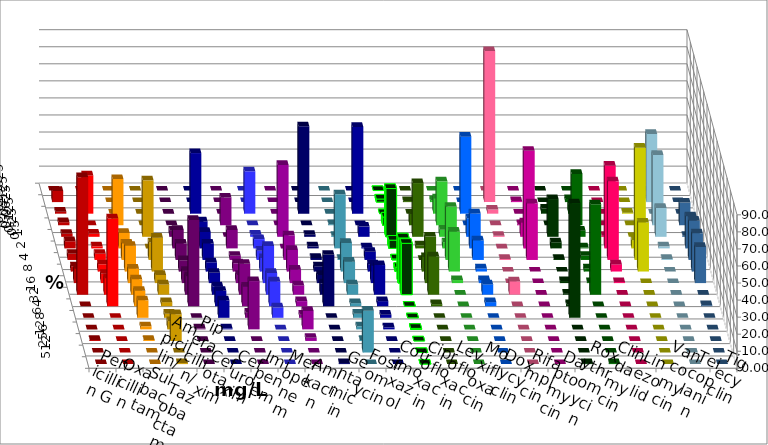
| Category | Penicillin G | Oxacillin | Ampicillin/ Sulbactam | Piperacillin/ Tazobactam | Cefotaxim | Cefuroxim | Imipenem | Meropenem | Amikacin | Gentamicin | Fosfomycin | Cotrimoxazol | Ciprofloxacin | Levofloxacin | Moxifloxacin | Doxycyclin | Rifampicin | Daptomycin | Roxythromycin | Clindamycin | Linezolid | Vancomycin | Teicoplanin | Tigecyclin |
|---|---|---|---|---|---|---|---|---|---|---|---|---|---|---|---|---|---|---|---|---|---|---|---|---|
| 0.015625 | 0 | 0 | 0 | 0 | 0 | 0 | 0 | 0 | 0 | 0 | 0 | 0 | 0 | 0 | 0 | 0 | 0 | 0 | 0 | 0 | 0 | 0 | 0 | 0 |
| 0.03125 | 6.587 | 0 | 0 | 0 | 0 | 0 | 0 | 0 | 0 | 0 | 0 | 0 | 1.807 | 0.606 | 1.198 | 0 | 88.554 | 0.602 | 0 | 1.807 | 0 | 0 | 0 | 40 |
| 0.0625 | 1.198 | 22.424 | 0 | 0 | 0 | 0 | 35.542 | 24.848 | 0 | 51.205 | 0 | 50.898 | 0 | 0 | 8.982 | 45.181 | 2.41 | 0 | 2.994 | 5.422 | 0 | 0.599 | 0 | 0 |
| 0.125 | 1.796 | 0 | 27.108 | 0 | 0 | 16.265 | 0 | 0 | 0 | 0 | 0.599 | 0 | 4.819 | 6.667 | 25.749 | 0 | 0 | 0.602 | 0 | 30.12 | 0 | 0 | 13.333 | 41.212 |
| 0.25 | 1.796 | 1.818 | 0 | 33.133 | 3.614 | 0 | 9.036 | 1.212 | 42.169 | 1.205 | 0.599 | 5.988 | 28.313 | 31.515 | 4.192 | 10.843 | 0.602 | 8.434 | 22.156 | 3.614 | 0.599 | 0 | 0.606 | 16.97 |
| 0.5 | 4.192 | 1.212 | 9.036 | 0 | 10.843 | 10.843 | 9.639 | 5.455 | 0 | 1.205 | 31.737 | 0.599 | 4.819 | 1.818 | 3.593 | 20.482 | 0 | 57.229 | 3.593 | 0.602 | 48.503 | 4.79 | 18.788 | 1.212 |
| 1.0 | 3.593 | 3.636 | 9.639 | 10.241 | 9.639 | 2.41 | 9.639 | 5.455 | 14.458 | 1.205 | 0.599 | 4.79 | 0.602 | 0 | 31.138 | 11.446 | 0.602 | 33.133 | 0.599 | 2.41 | 46.108 | 65.868 | 23.03 | 0.606 |
| 2.0 | 2.994 | 4.242 | 15.06 | 19.88 | 6.627 | 4.819 | 5.422 | 7.879 | 12.651 | 3.012 | 16.766 | 4.192 | 2.41 | 8.485 | 23.353 | 1.807 | 0 | 0 | 0 | 1.807 | 4.192 | 28.743 | 22.424 | 0 |
| 4.0 | 8.383 | 5.455 | 8.434 | 4.819 | 7.229 | 4.819 | 6.024 | 21.818 | 7.831 | 4.819 | 12.575 | 10.18 | 26.506 | 27.273 | 1.796 | 1.807 | 0 | 0 | 1.198 | 0.602 | 0.599 | 0 | 21.212 | 0 |
| 8.0 | 68.862 | 9.697 | 9.036 | 6.024 | 10.843 | 18.072 | 4.819 | 12.727 | 5.422 | 6.627 | 5.988 | 17.365 | 30.12 | 22.424 | 0 | 6.024 | 7.831 | 0 | 0.599 | 53.012 | 0 | 0 | 0 | 0 |
| 16.0 | 0 | 51.515 | 9.036 | 2.41 | 50.602 | 11.446 | 9.036 | 14.545 | 3.012 | 30.12 | 1.796 | 2.994 | 0 | 1.212 | 0 | 2.41 | 0 | 0 | 1.198 | 0 | 0 | 0 | 0.606 | 0 |
| 32.0 | 0 | 0 | 10.241 | 2.41 | 0 | 3.012 | 10.241 | 6.061 | 1.807 | 0 | 2.395 | 1.796 | 0 | 0 | 0 | 0 | 0 | 0 | 67.066 | 0 | 0 | 0 | 0 | 0 |
| 64.0 | 0 | 0 | 1.807 | 4.819 | 0.602 | 28.313 | 0.602 | 0 | 10.843 | 0 | 1.796 | 1.198 | 0.602 | 0 | 0 | 0 | 0 | 0 | 0 | 0 | 0 | 0 | 0 | 0 |
| 128.0 | 0.599 | 0 | 0.602 | 15.663 | 0 | 0 | 0 | 0 | 1.807 | 0 | 0.599 | 0 | 0 | 0 | 0 | 0 | 0 | 0 | 0 | 0 | 0 | 0 | 0 | 0 |
| 256.0 | 0 | 0 | 0 | 0 | 0 | 0 | 0 | 0 | 0 | 0 | 24.551 | 0 | 0 | 0 | 0 | 0 | 0 | 0 | 0 | 0 | 0 | 0 | 0 | 0 |
| 512.0 | 0 | 0 | 0 | 0.602 | 0 | 0 | 0 | 0 | 0 | 0.602 | 0 | 0 | 0 | 0 | 0 | 0 | 0 | 0 | 0.599 | 0.602 | 0 | 0 | 0 | 0 |